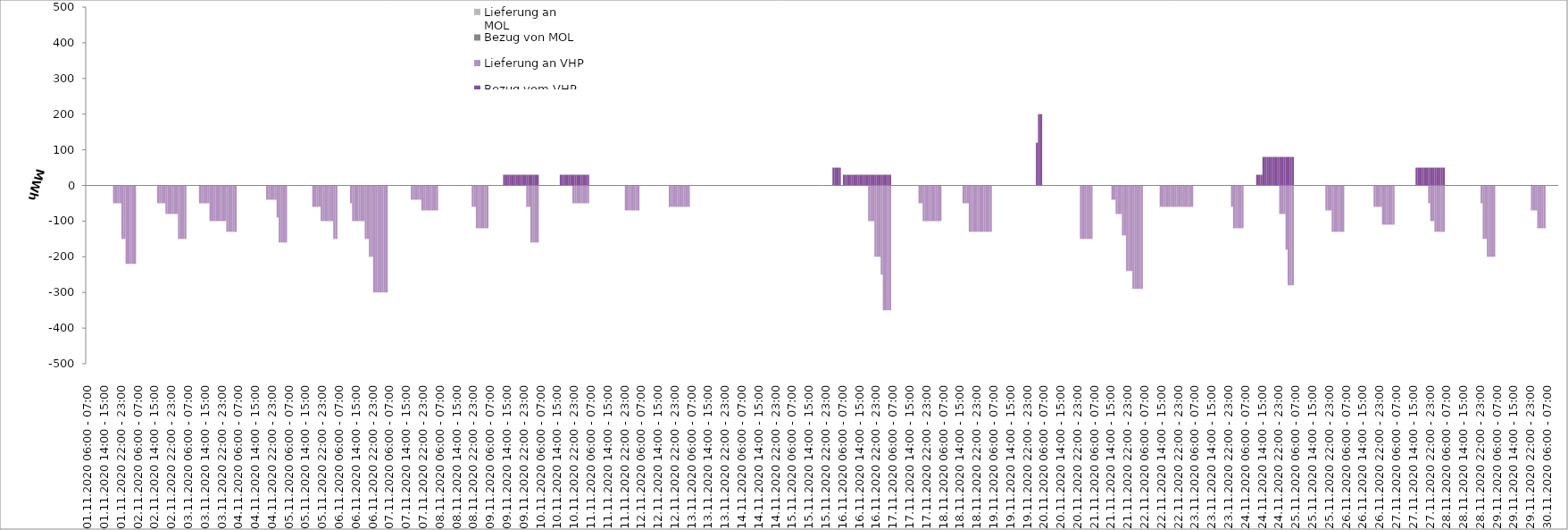
| Category | Bezug vom VHP | Lieferung an VHP | Bezug von MOL | Lieferung an MOL |
|---|---|---|---|---|
| 01.11.2020 06:00 - 07:00 | 0 | 0 | 0 | 0 |
| 01.11.2020 07:00 - 08:00 | 0 | 0 | 0 | 0 |
| 01.11.2020 08:00 - 09:00 | 0 | 0 | 0 | 0 |
| 01.11.2020 09:00 - 10:00 | 0 | 0 | 0 | 0 |
| 01.11.2020 10:00 - 11:00 | 0 | 0 | 0 | 0 |
| 01.11.2020 11:00 - 12:00 | 0 | 0 | 0 | 0 |
| 01.11.2020 12:00 - 13:00 | 0 | 0 | 0 | 0 |
| 01.11.2020 13:00 - 14:00 | 0 | 0 | 0 | 0 |
| 01.11.2020 14:00 - 15:00 | 0 | 0 | 0 | 0 |
| 01.11.2020 15:00 - 16:00 | 0 | 0 | 0 | 0 |
| 01.11.2020 16:00 - 17:00 | 0 | 0 | 0 | 0 |
| 01.11.2020 17:00 - 18:00 | 0 | 0 | 0 | 0 |
| 01.11.2020 18:00 - 19:00 | 0 | 0 | 0 | 0 |
| 01.11.2020 19:00 - 20:00 | 0 | -50 | 0 | 0 |
| 01.11.2020 20:00 - 21:00 | 0 | -50 | 0 | 0 |
| 01.11.2020 21:00 - 22:00 | 0 | -50 | 0 | 0 |
| 01.11.2020 22:00 - 23:00 | 0 | -50 | 0 | 0 |
| 01.11.2020 23:00 - 24:00 | 0 | -150 | 0 | 0 |
| 02.11.2020 00:00 - 01:00 | 0 | -150 | 0 | 0 |
| 02.11.2020 01:00 - 02:00 | 0 | -220 | 0 | 0 |
| 02.11.2020 02:00 - 03:00 | 0 | -220 | 0 | 0 |
| 02.11.2020 03:00 - 04:00 | 0 | -220 | 0 | 0 |
| 02.11.2020 04:00 - 05:00 | 0 | -220 | 0 | 0 |
| 02.11.2020 05:00 - 06:00 | 0 | -220 | 0 | 0 |
| 02.11.2020 06:00 - 07:00 | 0 | 0 | 0 | 0 |
| 02.11.2020 07:00 - 08:00 | 0 | 0 | 0 | 0 |
| 02.11.2020 08:00 - 09:00 | 0 | 0 | 0 | 0 |
| 02.11.2020 09:00 - 10:00 | 0 | 0 | 0 | 0 |
| 02.11.2020 10:00 - 11:00 | 0 | 0 | 0 | 0 |
| 02.11.2020 11:00 - 12:00 | 0 | 0 | 0 | 0 |
| 02.11.2020 12:00 - 13:00 | 0 | 0 | 0 | 0 |
| 02.11.2020 13:00 - 14:00 | 0 | 0 | 0 | 0 |
| 02.11.2020 14:00 - 15:00 | 0 | 0 | 0 | 0 |
| 02.11.2020 15:00 - 16:00 | 0 | 0 | 0 | 0 |
| 02.11.2020 16:00 - 17:00 | 0 | -50 | 0 | 0 |
| 02.11.2020 17:00 - 18:00 | 0 | -50 | 0 | 0 |
| 02.11.2020 18:00 - 19:00 | 0 | -50 | 0 | 0 |
| 02.11.2020 19:00 - 20:00 | 0 | -50 | 0 | 0 |
| 02.11.2020 20:00 - 21:00 | 0 | -80 | 0 | 0 |
| 02.11.2020 21:00 - 22:00 | 0 | -80 | 0 | 0 |
| 02.11.2020 22:00 - 23:00 | 0 | -80 | 0 | 0 |
| 02.11.2020 23:00 - 24:00 | 0 | -80 | 0 | 0 |
| 03.11.2020 00:00 - 01:00 | 0 | -80 | 0 | 0 |
| 03.11.2020 01:00 - 02:00 | 0 | -80 | 0 | 0 |
| 03.11.2020 02:00 - 03:00 | 0 | -150 | 0 | 0 |
| 03.11.2020 03:00 - 04:00 | 0 | -150 | 0 | 0 |
| 03.11.2020 04:00 - 05:00 | 0 | -150 | 0 | 0 |
| 03.11.2020 05:00 - 06:00 | 0 | -150 | 0 | 0 |
| 03.11.2020 06:00 - 07:00 | 0 | 0 | 0 | 0 |
| 03.11.2020 07:00 - 08:00 | 0 | 0 | 0 | 0 |
| 03.11.2020 08:00 - 09:00 | 0 | 0 | 0 | 0 |
| 03.11.2020 09:00 - 10:00 | 0 | 0 | 0 | 0 |
| 03.11.2020 10:00 - 11:00 | 0 | 0 | 0 | 0 |
| 03.11.2020 11:00 - 12:00 | 0 | 0 | 0 | 0 |
| 03.11.2020 12:00 - 13:00 | 0 | -50 | 0 | 0 |
| 03.11.2020 13:00 - 14:00 | 0 | -50 | 0 | 0 |
| 03.11.2020 14:00 - 15:00 | 0 | -50 | 0 | 0 |
| 03.11.2020 15:00 - 16:00 | 0 | -50 | 0 | 0 |
| 03.11.2020 16:00 - 17:00 | 0 | -50 | 0 | 0 |
| 03.11.2020 17:00 - 18:00 | 0 | -100 | 0 | 0 |
| 03.11.2020 18:00 - 19:00 | 0 | -100 | 0 | 0 |
| 03.11.2020 19:00 - 20:00 | 0 | -100 | 0 | 0 |
| 03.11.2020 20:00 - 21:00 | 0 | -100 | 0 | 0 |
| 03.11.2020 21:00 - 22:00 | 0 | -100 | 0 | 0 |
| 03.11.2020 22:00 - 23:00 | 0 | -100 | 0 | 0 |
| 03.11.2020 23:00 - 24:00 | 0 | -100 | 0 | 0 |
| 04.11.2020 00:00 - 01:00 | 0 | -100 | 0 | 0 |
| 04.11.2020 01:00 - 02:00 | 0 | -130 | 0 | 0 |
| 04.11.2020 02:00 - 03:00 | 0 | -130 | 0 | 0 |
| 04.11.2020 03:00 - 04:00 | 0 | -130 | 0 | 0 |
| 04.11.2020 04:00 - 05:00 | 0 | -130 | 0 | 0 |
| 04.11.2020 05:00 - 06:00 | 0 | -130 | 0 | 0 |
| 04.11.2020 06:00 - 07:00 | 0 | 0 | 0 | 0 |
| 04.11.2020 07:00 - 08:00 | 0 | 0 | 0 | 0 |
| 04.11.2020 08:00 - 09:00 | 0 | 0 | 0 | 0 |
| 04.11.2020 09:00 - 10:00 | 0 | 0 | 0 | 0 |
| 04.11.2020 10:00 - 11:00 | 0 | 0 | 0 | 0 |
| 04.11.2020 11:00 - 12:00 | 0 | 0 | 0 | 0 |
| 04.11.2020 12:00 - 13:00 | 0 | 0 | 0 | 0 |
| 04.11.2020 13:00 - 14:00 | 0 | 0 | 0 | 0 |
| 04.11.2020 14:00 - 15:00 | 0 | 0 | 0 | 0 |
| 04.11.2020 15:00 - 16:00 | 0 | 0 | 0 | 0 |
| 04.11.2020 16:00 - 17:00 | 0 | 0 | 0 | 0 |
| 04.11.2020 17:00 - 18:00 | 0 | 0 | 0 | 0 |
| 04.11.2020 18:00 - 19:00 | 0 | 0 | 0 | 0 |
| 04.11.2020 19:00 - 20:00 | 0 | 0 | 0 | 0 |
| 04.11.2020 20:00 - 21:00 | 0 | -40 | 0 | 0 |
| 04.11.2020 21:00 - 22:00 | 0 | -40 | 0 | 0 |
| 04.11.2020 22:00 - 23:00 | 0 | -40 | 0 | 0 |
| 04.11.2020 23:00 - 24:00 | 0 | -40 | 0 | 0 |
| 05.11.2020 00:00 - 01:00 | 0 | -40 | 0 | 0 |
| 05.11.2020 01:00 - 02:00 | 0 | -90 | 0 | 0 |
| 05.11.2020 02:00 - 03:00 | 0 | -160 | 0 | 0 |
| 05.11.2020 03:00 - 04:00 | 0 | -160 | 0 | 0 |
| 05.11.2020 04:00 - 05:00 | 0 | -160 | 0 | 0 |
| 05.11.2020 05:00 - 06:00 | 0 | -160 | 0 | 0 |
| 05.11.2020 06:00 - 07:00 | 0 | 0 | 0 | 0 |
| 05.11.2020 07:00 - 08:00 | 0 | 0 | 0 | 0 |
| 05.11.2020 08:00 - 09:00 | 0 | 0 | 0 | 0 |
| 05.11.2020 09:00 - 10:00 | 0 | 0 | 0 | 0 |
| 05.11.2020 10:00 - 11:00 | 0 | 0 | 0 | 0 |
| 05.11.2020 11:00 - 12:00 | 0 | 0 | 0 | 0 |
| 05.11.2020 12:00 - 13:00 | 0 | 0 | 0 | 0 |
| 05.11.2020 13:00 - 14:00 | 0 | 0 | 0 | 0 |
| 05.11.2020 14:00 - 15:00 | 0 | 0 | 0 | 0 |
| 05.11.2020 15:00 - 16:00 | 0 | 0 | 0 | 0 |
| 05.11.2020 16:00 - 17:00 | 0 | 0 | 0 | 0 |
| 05.11.2020 17:00 - 18:00 | 0 | 0 | 0 | 0 |
| 05.11.2020 18:00 - 19:00 | 0 | -60 | 0 | 0 |
| 05.11.2020 19:00 - 20:00 | 0 | -60 | 0 | 0 |
| 05.11.2020 20:00 - 21:00 | 0 | -60 | 0 | 0 |
| 05.11.2020 21:00 - 22:00 | 0 | -60 | 0 | 0 |
| 05.11.2020 22:00 - 23:00 | 0 | -100 | 0 | 0 |
| 05.11.2020 23:00 - 24:00 | 0 | -100 | 0 | 0 |
| 06.11.2020 00:00 - 01:00 | 0 | -100 | 0 | 0 |
| 06.11.2020 01:00 - 02:00 | 0 | -100 | 0 | 0 |
| 06.11.2020 02:00 - 03:00 | 0 | -100 | 0 | 0 |
| 06.11.2020 03:00 - 04:00 | 0 | -100 | 0 | 0 |
| 06.11.2020 04:00 - 05:00 | 0 | -150 | 0 | 0 |
| 06.11.2020 05:00 - 06:00 | 0 | -150 | 0 | 0 |
| 06.11.2020 06:00 - 07:00 | 0 | 0 | 0 | 0 |
| 06.11.2020 07:00 - 08:00 | 0 | 0 | 0 | 0 |
| 06.11.2020 08:00 - 09:00 | 0 | 0 | 0 | 0 |
| 06.11.2020 09:00 - 10:00 | 0 | 0 | 0 | 0 |
| 06.11.2020 10:00 - 11:00 | 0 | 0 | 0 | 0 |
| 06.11.2020 11:00 - 12:00 | 0 | 0 | 0 | 0 |
| 06.11.2020 12:00 - 13:00 | 0 | -50 | 0 | 0 |
| 06.11.2020 13:00 - 14:00 | 0 | -100 | 0 | 0 |
| 06.11.2020 14:00 - 15:00 | 0 | -100 | 0 | 0 |
| 06.11.2020 15:00 - 16:00 | 0 | -100 | 0 | 0 |
| 06.11.2020 16:00 - 17:00 | 0 | -100 | 0 | 0 |
| 06.11.2020 17:00 - 18:00 | 0 | -100 | 0 | 0 |
| 06.11.2020 18:00 - 19:00 | 0 | -100 | 0 | 0 |
| 06.11.2020 19:00 - 20:00 | 0 | -150 | 0 | 0 |
| 06.11.2020 20:00 - 21:00 | 0 | -150 | 0 | 0 |
| 06.11.2020 21:00 - 22:00 | 0 | -200 | 0 | 0 |
| 06.11.2020 22:00 - 23:00 | 0 | -200 | 0 | 0 |
| 06.11.2020 23:00 - 24:00 | 0 | -300 | 0 | 0 |
| 07.11.2020 00:00 - 01:00 | 0 | -300 | 0 | 0 |
| 07.11.2020 01:00 - 02:00 | 0 | -300 | 0 | 0 |
| 07.11.2020 02:00 - 03:00 | 0 | -300 | 0 | 0 |
| 07.11.2020 03:00 - 04:00 | 0 | -300 | 0 | 0 |
| 07.11.2020 04:00 - 05:00 | 0 | -300 | 0 | 0 |
| 07.11.2020 05:00 - 06:00 | 0 | -300 | 0 | 0 |
| 07.11.2020 06:00 - 07:00 | 0 | 0 | 0 | 0 |
| 07.11.2020 07:00 - 08:00 | 0 | 0 | 0 | 0 |
| 07.11.2020 08:00 - 09:00 | 0 | 0 | 0 | 0 |
| 07.11.2020 09:00 - 10:00 | 0 | 0 | 0 | 0 |
| 07.11.2020 10:00 - 11:00 | 0 | 0 | 0 | 0 |
| 07.11.2020 11:00 - 12:00 | 0 | 0 | 0 | 0 |
| 07.11.2020 12:00 - 13:00 | 0 | 0 | 0 | 0 |
| 07.11.2020 13:00 - 14:00 | 0 | 0 | 0 | 0 |
| 07.11.2020 14:00 - 15:00 | 0 | 0 | 0 | 0 |
| 07.11.2020 15:00 - 16:00 | 0 | 0 | 0 | 0 |
| 07.11.2020 16:00 - 17:00 | 0 | 0 | 0 | 0 |
| 07.11.2020 17:00 - 18:00 | 0 | -40 | 0 | 0 |
| 07.11.2020 18:00 - 19:00 | 0 | -40 | 0 | 0 |
| 07.11.2020 19:00 - 20:00 | 0 | -40 | 0 | 0 |
| 07.11.2020 20:00 - 21:00 | 0 | -40 | 0 | 0 |
| 07.11.2020 21:00 - 22:00 | 0 | -40 | 0 | 0 |
| 07.11.2020 22:00 - 23:00 | 0 | -70 | 0 | 0 |
| 07.11.2020 23:00 - 24:00 | 0 | -70 | 0 | 0 |
| 08.11.2020 00:00 - 01:00 | 0 | -70 | 0 | 0 |
| 08.11.2020 01:00 - 02:00 | 0 | -70 | 0 | 0 |
| 08.11.2020 02:00 - 03:00 | 0 | -70 | 0 | 0 |
| 08.11.2020 03:00 - 04:00 | 0 | -70 | 0 | 0 |
| 08.11.2020 04:00 - 05:00 | 0 | -70 | 0 | 0 |
| 08.11.2020 05:00 - 06:00 | 0 | -70 | 0 | 0 |
| 08.11.2020 06:00 - 07:00 | 0 | 0 | 0 | 0 |
| 08.11.2020 07:00 - 08:00 | 0 | 0 | 0 | 0 |
| 08.11.2020 08:00 - 09:00 | 0 | 0 | 0 | 0 |
| 08.11.2020 09:00 - 10:00 | 0 | 0 | 0 | 0 |
| 08.11.2020 10:00 - 11:00 | 0 | 0 | 0 | 0 |
| 08.11.2020 11:00 - 12:00 | 0 | 0 | 0 | 0 |
| 08.11.2020 12:00 - 13:00 | 0 | 0 | 0 | 0 |
| 08.11.2020 13:00 - 14:00 | 0 | 0 | 0 | 0 |
| 08.11.2020 14:00 - 15:00 | 0 | 0 | 0 | 0 |
| 08.11.2020 15:00 - 16:00 | 0 | 0 | 0 | 0 |
| 08.11.2020 16:00 - 17:00 | 0 | 0 | 0 | 0 |
| 08.11.2020 17:00 - 18:00 | 0 | 0 | 0 | 0 |
| 08.11.2020 18:00 - 19:00 | 0 | 0 | 0 | 0 |
| 08.11.2020 19:00 - 20:00 | 0 | 0 | 0 | 0 |
| 08.11.2020 20:00 - 21:00 | 0 | 0 | 0 | 0 |
| 08.11.2020 21:00 - 22:00 | 0 | 0 | 0 | 0 |
| 08.11.2020 22:00 - 23:00 | 0 | -60 | 0 | 0 |
| 08.11.2020 23:00 - 24:00 | 0 | -60 | 0 | 0 |
| 09.11.2020 00:00 - 01:00 | 0 | -120 | 0 | 0 |
| 09.11.2020 01:00 - 02:00 | 0 | -120 | 0 | 0 |
| 09.11.2020 02:00 - 03:00 | 0 | -120 | 0 | 0 |
| 09.11.2020 03:00 - 04:00 | 0 | -120 | 0 | 0 |
| 09.11.2020 04:00 - 05:00 | 0 | -120 | 0 | 0 |
| 09.11.2020 05:00 - 06:00 | 0 | -120 | 0 | 0 |
| 09.11.2020 06:00 - 07:00 | 0 | 0 | 0 | 0 |
| 09.11.2020 07:00 - 08:00 | 0 | 0 | 0 | 0 |
| 09.11.2020 08:00 - 09:00 | 0 | 0 | 0 | 0 |
| 09.11.2020 09:00 - 10:00 | 0 | 0 | 0 | 0 |
| 09.11.2020 10:00 - 11:00 | 0 | 0 | 0 | 0 |
| 09.11.2020 11:00 - 12:00 | 0 | 0 | 0 | 0 |
| 09.11.2020 12:00 - 13:00 | 0 | 0 | 0 | 0 |
| 09.11.2020 13:00 - 14:00 | 30 | 0 | 0 | 0 |
| 09.11.2020 14:00 - 15:00 | 30 | 0 | 0 | 0 |
| 09.11.2020 15:00 - 16:00 | 30 | 0 | 0 | 0 |
| 09.11.2020 16:00 - 17:00 | 30 | 0 | 0 | 0 |
| 09.11.2020 17:00 - 18:00 | 30 | 0 | 0 | 0 |
| 09.11.2020 18:00 - 19:00 | 30 | 0 | 0 | 0 |
| 09.11.2020 19:00 - 20:00 | 30 | 0 | 0 | 0 |
| 09.11.2020 20:00 - 21:00 | 30 | 0 | 0 | 0 |
| 09.11.2020 21:00 - 22:00 | 30 | 0 | 0 | 0 |
| 09.11.2020 22:00 - 23:00 | 30 | 0 | 0 | 0 |
| 09.11.2020 23:00 - 24:00 | 30 | 0 | 0 | 0 |
| 10.11.2020 00:00 - 01:00 | 30 | -60 | 0 | 0 |
| 10.11.2020 01:00 - 02:00 | 30 | -60 | 0 | 0 |
| 10.11.2020 02:00 - 03:00 | 30 | -160 | 0 | 0 |
| 10.11.2020 03:00 - 04:00 | 30 | -160 | 0 | 0 |
| 10.11.2020 04:00 - 05:00 | 30 | -160 | 0 | 0 |
| 10.11.2020 05:00 - 06:00 | 30 | -160 | 0 | 0 |
| 10.11.2020 06:00 - 07:00 | 0 | 0 | 0 | 0 |
| 10.11.2020 07:00 - 08:00 | 0 | 0 | 0 | 0 |
| 10.11.2020 08:00 - 09:00 | 0 | 0 | 0 | 0 |
| 10.11.2020 09:00 - 10:00 | 0 | 0 | 0 | 0 |
| 10.11.2020 10:00 - 11:00 | 0 | 0 | 0 | 0 |
| 10.11.2020 11:00 - 12:00 | 0 | 0 | 0 | 0 |
| 10.11.2020 12:00 - 13:00 | 0 | 0 | 0 | 0 |
| 10.11.2020 13:00 - 14:00 | 0 | 0 | 0 | 0 |
| 10.11.2020 14:00 - 15:00 | 0 | 0 | 0 | 0 |
| 10.11.2020 15:00 - 16:00 | 0 | 0 | 0 | 0 |
| 10.11.2020 16:00 - 17:00 | 30 | 0 | 0 | 0 |
| 10.11.2020 17:00 - 18:00 | 30 | 0 | 0 | 0 |
| 10.11.2020 18:00 - 19:00 | 30 | 0 | 0 | 0 |
| 10.11.2020 19:00 - 20:00 | 30 | 0 | 0 | 0 |
| 10.11.2020 20:00 - 21:00 | 30 | 0 | 0 | 0 |
| 10.11.2020 21:00 - 22:00 | 30 | 0 | 0 | 0 |
| 10.11.2020 22:00 - 23:00 | 30 | -50 | 0 | 0 |
| 10.11.2020 23:00 - 24:00 | 30 | -50 | 0 | 0 |
| 11.11.2020 00:00 - 01:00 | 30 | -50 | 0 | 0 |
| 11.11.2020 01:00 - 02:00 | 30 | -50 | 0 | 0 |
| 11.11.2020 02:00 - 03:00 | 30 | -50 | 0 | 0 |
| 11.11.2020 03:00 - 04:00 | 30 | -50 | 0 | 0 |
| 11.11.2020 04:00 - 05:00 | 30 | -50 | 0 | 0 |
| 11.11.2020 05:00 - 06:00 | 30 | -50 | 0 | 0 |
| 11.11.2020 06:00 - 07:00 | 0 | 0 | 0 | 0 |
| 11.11.2020 07:00 - 08:00 | 0 | 0 | 0 | 0 |
| 11.11.2020 08:00 - 09:00 | 0 | 0 | 0 | 0 |
| 11.11.2020 09:00 - 10:00 | 0 | 0 | 0 | 0 |
| 11.11.2020 10:00 - 11:00 | 0 | 0 | 0 | 0 |
| 11.11.2020 11:00 - 12:00 | 0 | 0 | 0 | 0 |
| 11.11.2020 12:00 - 13:00 | 0 | 0 | 0 | 0 |
| 11.11.2020 13:00 - 14:00 | 0 | 0 | 0 | 0 |
| 11.11.2020 14:00 - 15:00 | 0 | 0 | 0 | 0 |
| 11.11.2020 15:00 - 16:00 | 0 | 0 | 0 | 0 |
| 11.11.2020 16:00 - 17:00 | 0 | 0 | 0 | 0 |
| 11.11.2020 17:00 - 18:00 | 0 | 0 | 0 | 0 |
| 11.11.2020 18:00 - 19:00 | 0 | 0 | 0 | 0 |
| 11.11.2020 19:00 - 20:00 | 0 | 0 | 0 | 0 |
| 11.11.2020 20:00 - 21:00 | 0 | 0 | 0 | 0 |
| 11.11.2020 21:00 - 22:00 | 0 | 0 | 0 | 0 |
| 11.11.2020 22:00 - 23:00 | 0 | 0 | 0 | 0 |
| 11.11.2020 23:00 - 24:00 | 0 | -70 | 0 | 0 |
| 12.11.2020 00:00 - 01:00 | 0 | -70 | 0 | 0 |
| 12.11.2020 01:00 - 02:00 | 0 | -70 | 0 | 0 |
| 12.11.2020 02:00 - 03:00 | 0 | -70 | 0 | 0 |
| 12.11.2020 03:00 - 04:00 | 0 | -70 | 0 | 0 |
| 12.11.2020 04:00 - 05:00 | 0 | -70 | 0 | 0 |
| 12.11.2020 05:00 - 06:00 | 0 | -70 | 0 | 0 |
| 12.11.2020 06:00 - 07:00 | 0 | 0 | 0 | 0 |
| 12.11.2020 07:00 - 08:00 | 0 | 0 | 0 | 0 |
| 12.11.2020 08:00 - 09:00 | 0 | 0 | 0 | 0 |
| 12.11.2020 09:00 - 10:00 | 0 | 0 | 0 | 0 |
| 12.11.2020 10:00 - 11:00 | 0 | 0 | 0 | 0 |
| 12.11.2020 11:00 - 12:00 | 0 | 0 | 0 | 0 |
| 12.11.2020 12:00 - 13:00 | 0 | 0 | 0 | 0 |
| 12.11.2020 13:00 - 14:00 | 0 | 0 | 0 | 0 |
| 12.11.2020 14:00 - 15:00 | 0 | 0 | 0 | 0 |
| 12.11.2020 15:00 - 16:00 | 0 | 0 | 0 | 0 |
| 12.11.2020 16:00 - 17:00 | 0 | 0 | 0 | 0 |
| 12.11.2020 17:00 - 18:00 | 0 | 0 | 0 | 0 |
| 12.11.2020 18:00 - 19:00 | 0 | 0 | 0 | 0 |
| 12.11.2020 19:00 - 20:00 | 0 | 0 | 0 | 0 |
| 12.11.2020 20:00 - 21:00 | 0 | -60 | 0 | 0 |
| 12.11.2020 21:00 - 22:00 | 0 | -60 | 0 | 0 |
| 12.11.2020 22:00 - 23:00 | 0 | -60 | 0 | 0 |
| 12.11.2020 23:00 - 24:00 | 0 | -60 | 0 | 0 |
| 13.11.2020 00:00 - 01:00 | 0 | -60 | 0 | 0 |
| 13.11.2020 01:00 - 02:00 | 0 | -60 | 0 | 0 |
| 13.11.2020 02:00 - 03:00 | 0 | -60 | 0 | 0 |
| 13.11.2020 03:00 - 04:00 | 0 | -60 | 0 | 0 |
| 13.11.2020 04:00 - 05:00 | 0 | -60 | 0 | 0 |
| 13.11.2020 05:00 - 06:00 | 0 | -60 | 0 | 0 |
| 13.11.2020 06:00 - 07:00 | 0 | 0 | 0 | 0 |
| 13.11.2020 07:00 - 08:00 | 0 | 0 | 0 | 0 |
| 13.11.2020 08:00 - 09:00 | 0 | 0 | 0 | 0 |
| 13.11.2020 09:00 - 10:00 | 0 | 0 | 0 | 0 |
| 13.11.2020 10:00 - 11:00 | 0 | 0 | 0 | 0 |
| 13.11.2020 11:00 - 12:00 | 0 | 0 | 0 | 0 |
| 13.11.2020 12:00 - 13:00 | 0 | 0 | 0 | 0 |
| 13.11.2020 13:00 - 14:00 | 0 | 0 | 0 | 0 |
| 13.11.2020 14:00 - 15:00 | 0 | 0 | 0 | 0 |
| 13.11.2020 15:00 - 16:00 | 0 | 0 | 0 | 0 |
| 13.11.2020 16:00 - 17:00 | 0 | 0 | 0 | 0 |
| 13.11.2020 17:00 - 18:00 | 0 | 0 | 0 | 0 |
| 13.11.2020 18:00 - 19:00 | 0 | 0 | 0 | 0 |
| 13.11.2020 19:00 - 20:00 | 0 | 0 | 0 | 0 |
| 13.11.2020 20:00 - 21:00 | 0 | 0 | 0 | 0 |
| 13.11.2020 21:00 - 22:00 | 0 | 0 | 0 | 0 |
| 13.11.2020 22:00 - 23:00 | 0 | 0 | 0 | 0 |
| 13.11.2020 23:00 - 24:00 | 0 | 0 | 0 | 0 |
| 14.11.2020 00:00 - 01:00 | 0 | 0 | 0 | 0 |
| 14.11.2020 01:00 - 02:00 | 0 | 0 | 0 | 0 |
| 14.11.2020 02:00 - 03:00 | 0 | 0 | 0 | 0 |
| 14.11.2020 03:00 - 04:00 | 0 | 0 | 0 | 0 |
| 14.11.2020 04:00 - 05:00 | 0 | 0 | 0 | 0 |
| 14.11.2020 05:00 - 06:00 | 0 | 0 | 0 | 0 |
| 14.11.2020 06:00 - 07:00 | 0 | 0 | 0 | 0 |
| 14.11.2020 07:00 - 08:00 | 0 | 0 | 0 | 0 |
| 14.11.2020 08:00 - 09:00 | 0 | 0 | 0 | 0 |
| 14.11.2020 09:00 - 10:00 | 0 | 0 | 0 | 0 |
| 14.11.2020 10:00 - 11:00 | 0 | 0 | 0 | 0 |
| 14.11.2020 11:00 - 12:00 | 0 | 0 | 0 | 0 |
| 14.11.2020 12:00 - 13:00 | 0 | 0 | 0 | 0 |
| 14.11.2020 13:00 - 14:00 | 0 | 0 | 0 | 0 |
| 14.11.2020 14:00 - 15:00 | 0 | 0 | 0 | 0 |
| 14.11.2020 15:00 - 16:00 | 0 | 0 | 0 | 0 |
| 14.11.2020 16:00 - 17:00 | 0 | 0 | 0 | 0 |
| 14.11.2020 17:00 - 18:00 | 0 | 0 | 0 | 0 |
| 14.11.2020 18:00 - 19:00 | 0 | 0 | 0 | 0 |
| 14.11.2020 19:00 - 20:00 | 0 | 0 | 0 | 0 |
| 14.11.2020 20:00 - 21:00 | 0 | 0 | 0 | 0 |
| 14.11.2020 21:00 - 22:00 | 0 | 0 | 0 | 0 |
| 14.11.2020 22:00 - 23:00 | 0 | 0 | 0 | 0 |
| 14.11.2020 23:00 - 24:00 | 0 | 0 | 0 | 0 |
| 15.11.2020 00:00 - 01:00 | 0 | 0 | 0 | 0 |
| 15.11.2020 01:00 - 02:00 | 0 | 0 | 0 | 0 |
| 15.11.2020 02:00 - 03:00 | 0 | 0 | 0 | 0 |
| 15.11.2020 03:00 - 04:00 | 0 | 0 | 0 | 0 |
| 15.11.2020 04:00 - 05:00 | 0 | 0 | 0 | 0 |
| 15.11.2020 05:00 - 06:00 | 0 | 0 | 0 | 0 |
| 15.11.2020 06:00 - 07:00 | 0 | 0 | 0 | 0 |
| 15.11.2020 07:00 - 08:00 | 0 | 0 | 0 | 0 |
| 15.11.2020 08:00 - 09:00 | 0 | 0 | 0 | 0 |
| 15.11.2020 09:00 - 10:00 | 0 | 0 | 0 | 0 |
| 15.11.2020 10:00 - 11:00 | 0 | 0 | 0 | 0 |
| 15.11.2020 11:00 - 12:00 | 0 | 0 | 0 | 0 |
| 15.11.2020 12:00 - 13:00 | 0 | 0 | 0 | 0 |
| 15.11.2020 13:00 - 14:00 | 0 | 0 | 0 | 0 |
| 15.11.2020 14:00 - 15:00 | 0 | 0 | 0 | 0 |
| 15.11.2020 15:00 - 16:00 | 0 | 0 | 0 | 0 |
| 15.11.2020 16:00 - 17:00 | 0 | 0 | 0 | 0 |
| 15.11.2020 17:00 - 18:00 | 0 | 0 | 0 | 0 |
| 15.11.2020 18:00 - 19:00 | 0 | 0 | 0 | 0 |
| 15.11.2020 19:00 - 20:00 | 0 | 0 | 0 | 0 |
| 15.11.2020 20:00 - 21:00 | 0 | 0 | 0 | 0 |
| 15.11.2020 21:00 - 22:00 | 0 | 0 | 0 | 0 |
| 15.11.2020 22:00 - 23:00 | 0 | 0 | 0 | 0 |
| 15.11.2020 23:00 - 24:00 | 0 | 0 | 0 | 0 |
| 16.11.2020 00:00 - 01:00 | 0 | 0 | 0 | 0 |
| 16.11.2020 01:00 - 02:00 | 0 | 0 | 0 | 0 |
| 16.11.2020 02:00 - 03:00 | 50 | 0 | 0 | 0 |
| 16.11.2020 03:00 - 04:00 | 50 | 0 | 0 | 0 |
| 16.11.2020 04:00 - 05:00 | 50 | 0 | 0 | 0 |
| 16.11.2020 05:00 - 06:00 | 50 | 0 | 0 | 0 |
| 16.11.2020 06:00 - 07:00 | 0 | 0 | 0 | 0 |
| 16.11.2020 07:00 - 08:00 | 30 | 0 | 0 | 0 |
| 16.11.2020 08:00 - 09:00 | 30 | 0 | 0 | 0 |
| 16.11.2020 09:00 - 10:00 | 30 | 0 | 0 | 0 |
| 16.11.2020 10:00 - 11:00 | 30 | 0 | 0 | 0 |
| 16.11.2020 11:00 - 12:00 | 30 | 0 | 0 | 0 |
| 16.11.2020 12:00 - 13:00 | 30 | 0 | 0 | 0 |
| 16.11.2020 13:00 - 14:00 | 30 | 0 | 0 | 0 |
| 16.11.2020 14:00 - 15:00 | 30 | 0 | 0 | 0 |
| 16.11.2020 15:00 - 16:00 | 30 | 0 | 0 | 0 |
| 16.11.2020 16:00 - 17:00 | 30 | 0 | 0 | 0 |
| 16.11.2020 17:00 - 18:00 | 30 | 0 | 0 | 0 |
| 16.11.2020 18:00 - 19:00 | 30 | 0 | 0 | 0 |
| 16.11.2020 19:00 - 20:00 | 30 | -100 | 0 | 0 |
| 16.11.2020 20:00 - 21:00 | 30 | -100 | 0 | 0 |
| 16.11.2020 21:00 - 22:00 | 30 | -100 | 0 | 0 |
| 16.11.2020 22:00 - 23:00 | 30 | -200 | 0 | 0 |
| 16.11.2020 23:00 - 24:00 | 30 | -200 | 0 | 0 |
| 17.11.2020 00:00 - 01:00 | 30 | -200 | 0 | 0 |
| 17.11.2020 01:00 - 02:00 | 30 | -250 | 0 | 0 |
| 17.11.2020 02:00 - 03:00 | 30 | -350 | 0 | 0 |
| 17.11.2020 03:00 - 04:00 | 30 | -350 | 0 | 0 |
| 17.11.2020 04:00 - 05:00 | 30 | -350 | 0 | 0 |
| 17.11.2020 05:00 - 06:00 | 30 | -350 | 0 | 0 |
| 17.11.2020 06:00 - 07:00 | 0 | 0 | 0 | 0 |
| 17.11.2020 07:00 - 08:00 | 0 | 0 | 0 | 0 |
| 17.11.2020 08:00 - 09:00 | 0 | 0 | 0 | 0 |
| 17.11.2020 09:00 - 10:00 | 0 | 0 | 0 | 0 |
| 17.11.2020 10:00 - 11:00 | 0 | 0 | 0 | 0 |
| 17.11.2020 11:00 - 12:00 | 0 | 0 | 0 | 0 |
| 17.11.2020 12:00 - 13:00 | 0 | 0 | 0 | 0 |
| 17.11.2020 13:00 - 14:00 | 0 | 0 | 0 | 0 |
| 17.11.2020 14:00 - 15:00 | 0 | 0 | 0 | 0 |
| 17.11.2020 15:00 - 16:00 | 0 | 0 | 0 | 0 |
| 17.11.2020 16:00 - 17:00 | 0 | 0 | 0 | 0 |
| 17.11.2020 17:00 - 18:00 | 0 | 0 | 0 | 0 |
| 17.11.2020 18:00 - 19:00 | 0 | 0 | 0 | 0 |
| 17.11.2020 19:00 - 20:00 | 0 | -50 | 0 | 0 |
| 17.11.2020 20:00 - 21:00 | 0 | -50 | 0 | 0 |
| 17.11.2020 21:00 - 22:00 | 0 | -100 | 0 | 0 |
| 17.11.2020 22:00 - 23:00 | 0 | -100 | 0 | 0 |
| 17.11.2020 23:00 - 24:00 | 0 | -100 | 0 | 0 |
| 18.11.2020 00:00 - 01:00 | 0 | -100 | 0 | 0 |
| 18.11.2020 01:00 - 02:00 | 0 | -100 | 0 | 0 |
| 18.11.2020 02:00 - 03:00 | 0 | -100 | 0 | 0 |
| 18.11.2020 03:00 - 04:00 | 0 | -100 | 0 | 0 |
| 18.11.2020 04:00 - 05:00 | 0 | -100 | 0 | 0 |
| 18.11.2020 05:00 - 06:00 | 0 | -100 | 0 | 0 |
| 18.11.2020 06:00 - 07:00 | 0 | 0 | 0 | 0 |
| 18.11.2020 07:00 - 08:00 | 0 | 0 | 0 | 0 |
| 18.11.2020 08:00 - 09:00 | 0 | 0 | 0 | 0 |
| 18.11.2020 09:00 - 10:00 | 0 | 0 | 0 | 0 |
| 18.11.2020 10:00 - 11:00 | 0 | 0 | 0 | 0 |
| 18.11.2020 11:00 - 12:00 | 0 | 0 | 0 | 0 |
| 18.11.2020 12:00 - 13:00 | 0 | 0 | 0 | 0 |
| 18.11.2020 13:00 - 14:00 | 0 | 0 | 0 | 0 |
| 18.11.2020 14:00 - 15:00 | 0 | 0 | 0 | 0 |
| 18.11.2020 15:00 - 16:00 | 0 | 0 | 0 | 0 |
| 18.11.2020 16:00 - 17:00 | 0 | -50 | 0 | 0 |
| 18.11.2020 17:00 - 18:00 | 0 | -50 | 0 | 0 |
| 18.11.2020 18:00 - 19:00 | 0 | -50 | 0 | 0 |
| 18.11.2020 19:00 - 20:00 | 0 | -130 | 0 | 0 |
| 18.11.2020 20:00 - 21:00 | 0 | -130 | 0 | 0 |
| 18.11.2020 21:00 - 22:00 | 0 | -130 | 0 | 0 |
| 18.11.2020 22:00 - 23:00 | 0 | -130 | 0 | 0 |
| 18.11.2020 23:00 - 24:00 | 0 | -130 | 0 | 0 |
| 19.11.2020 00:00 - 01:00 | 0 | -130 | 0 | 0 |
| 19.11.2020 01:00 - 02:00 | 0 | -130 | 0 | 0 |
| 19.11.2020 02:00 - 03:00 | 0 | -130 | 0 | 0 |
| 19.11.2020 03:00 - 04:00 | 0 | -130 | 0 | 0 |
| 19.11.2020 04:00 - 05:00 | 0 | -130 | 0 | 0 |
| 19.11.2020 05:00 - 06:00 | 0 | -130 | 0 | 0 |
| 19.11.2020 06:00 - 07:00 | 0 | 0 | 0 | 0 |
| 19.11.2020 07:00 - 08:00 | 0 | 0 | 0 | 0 |
| 19.11.2020 08:00 - 09:00 | 0 | 0 | 0 | 0 |
| 19.11.2020 09:00 - 10:00 | 0 | 0 | 0 | 0 |
| 19.11.2020 10:00 - 11:00 | 0 | 0 | 0 | 0 |
| 19.11.2020 11:00 - 12:00 | 0 | 0 | 0 | 0 |
| 19.11.2020 12:00 - 13:00 | 0 | 0 | 0 | 0 |
| 19.11.2020 13:00 - 14:00 | 0 | 0 | 0 | 0 |
| 19.11.2020 14:00 - 15:00 | 0 | 0 | 0 | 0 |
| 19.11.2020 15:00 - 16:00 | 0 | 0 | 0 | 0 |
| 19.11.2020 16:00 - 17:00 | 0 | 0 | 0 | 0 |
| 19.11.2020 17:00 - 18:00 | 0 | 0 | 0 | 0 |
| 19.11.2020 18:00 - 19:00 | 0 | 0 | 0 | 0 |
| 19.11.2020 19:00 - 20:00 | 0 | 0 | 0 | 0 |
| 19.11.2020 20:00 - 21:00 | 0 | 0 | 0 | 0 |
| 19.11.2020 21:00 - 22:00 | 0 | 0 | 0 | 0 |
| 19.11.2020 22:00 - 23:00 | 0 | 0 | 0 | 0 |
| 19.11.2020 23:00 - 24:00 | 0 | 0 | 0 | 0 |
| 20.11.2020 00:00 - 01:00 | 0 | 0 | 0 | 0 |
| 20.11.2020 01:00 - 02:00 | 0 | 0 | 0 | 0 |
| 20.11.2020 02:00 - 03:00 | 0 | 0 | 0 | 0 |
| 20.11.2020 03:00 - 04:00 | 120 | 0 | 0 | 0 |
| 20.11.2020 04:00 - 05:00 | 200 | 0 | 0 | 0 |
| 20.11.2020 05:00 - 06:00 | 200 | 0 | 0 | 0 |
| 20.11.2020 06:00 - 07:00 | 0 | 0 | 0 | 0 |
| 20.11.2020 07:00 - 08:00 | 0 | 0 | 0 | 0 |
| 20.11.2020 08:00 - 09:00 | 0 | 0 | 0 | 0 |
| 20.11.2020 09:00 - 10:00 | 0 | 0 | 0 | 0 |
| 20.11.2020 10:00 - 11:00 | 0 | 0 | 0 | 0 |
| 20.11.2020 11:00 - 12:00 | 0 | 0 | 0 | 0 |
| 20.11.2020 12:00 - 13:00 | 0 | 0 | 0 | 0 |
| 20.11.2020 13:00 - 14:00 | 0 | 0 | 0 | 0 |
| 20.11.2020 14:00 - 15:00 | 0 | 0 | 0 | 0 |
| 20.11.2020 15:00 - 16:00 | 0 | 0 | 0 | 0 |
| 20.11.2020 16:00 - 17:00 | 0 | 0 | 0 | 0 |
| 20.11.2020 17:00 - 18:00 | 0 | 0 | 0 | 0 |
| 20.11.2020 18:00 - 19:00 | 0 | 0 | 0 | 0 |
| 20.11.2020 19:00 - 20:00 | 0 | 0 | 0 | 0 |
| 20.11.2020 20:00 - 21:00 | 0 | 0 | 0 | 0 |
| 20.11.2020 21:00 - 22:00 | 0 | 0 | 0 | 0 |
| 20.11.2020 22:00 - 23:00 | 0 | 0 | 0 | 0 |
| 20.11.2020 23:00 - 24:00 | 0 | 0 | 0 | 0 |
| 21.11.2020 00:00 - 01:00 | 0 | -150 | 0 | 0 |
| 21.11.2020 01:00 - 02:00 | 0 | -150 | 0 | 0 |
| 21.11.2020 02:00 - 03:00 | 0 | -150 | 0 | 0 |
| 21.11.2020 03:00 - 04:00 | 0 | -150 | 0 | 0 |
| 21.11.2020 04:00 - 05:00 | 0 | -150 | 0 | 0 |
| 21.11.2020 05:00 - 06:00 | 0 | -150 | 0 | 0 |
| 21.11.2020 06:00 - 07:00 | 0 | 0 | 0 | 0 |
| 21.11.2020 07:00 - 08:00 | 0 | 0 | 0 | 0 |
| 21.11.2020 08:00 - 09:00 | 0 | 0 | 0 | 0 |
| 21.11.2020 09:00 - 10:00 | 0 | 0 | 0 | 0 |
| 21.11.2020 10:00 - 11:00 | 0 | 0 | 0 | 0 |
| 21.11.2020 11:00 - 12:00 | 0 | 0 | 0 | 0 |
| 21.11.2020 12:00 - 13:00 | 0 | 0 | 0 | 0 |
| 21.11.2020 13:00 - 14:00 | 0 | 0 | 0 | 0 |
| 21.11.2020 14:00 - 15:00 | 0 | 0 | 0 | 0 |
| 21.11.2020 15:00 - 16:00 | 0 | -40 | 0 | 0 |
| 21.11.2020 16:00 - 17:00 | 0 | -40 | 0 | 0 |
| 21.11.2020 17:00 - 18:00 | 0 | -80 | 0 | 0 |
| 21.11.2020 18:00 - 19:00 | 0 | -80 | 0 | 0 |
| 21.11.2020 19:00 - 20:00 | 0 | -80 | 0 | 0 |
| 21.11.2020 20:00 - 21:00 | 0 | -140 | 0 | 0 |
| 21.11.2020 21:00 - 22:00 | 0 | -140 | 0 | 0 |
| 21.11.2020 22:00 - 23:00 | 0 | -240 | 0 | 0 |
| 21.11.2020 23:00 - 24:00 | 0 | -240 | 0 | 0 |
| 22.11.2020 00:00 - 01:00 | 0 | -240 | 0 | 0 |
| 22.11.2020 01:00 - 02:00 | 0 | -290 | 0 | 0 |
| 22.11.2020 02:00 - 03:00 | 0 | -290 | 0 | 0 |
| 22.11.2020 03:00 - 04:00 | 0 | -290 | 0 | 0 |
| 22.11.2020 04:00 - 05:00 | 0 | -290 | 0 | 0 |
| 22.11.2020 05:00 - 06:00 | 0 | -290 | 0 | 0 |
| 22.11.2020 06:00 - 07:00 | 0 | 0 | 0 | 0 |
| 22.11.2020 07:00 - 08:00 | 0 | 0 | 0 | 0 |
| 22.11.2020 08:00 - 09:00 | 0 | 0 | 0 | 0 |
| 22.11.2020 09:00 - 10:00 | 0 | 0 | 0 | 0 |
| 22.11.2020 10:00 - 11:00 | 0 | 0 | 0 | 0 |
| 22.11.2020 11:00 - 12:00 | 0 | 0 | 0 | 0 |
| 22.11.2020 12:00 - 13:00 | 0 | 0 | 0 | 0 |
| 22.11.2020 13:00 - 14:00 | 0 | 0 | 0 | 0 |
| 22.11.2020 14:00 - 15:00 | 0 | -60 | 0 | 0 |
| 22.11.2020 15:00 - 16:00 | 0 | -60 | 0 | 0 |
| 22.11.2020 16:00 - 17:00 | 0 | -60 | 0 | 0 |
| 22.11.2020 17:00 - 18:00 | 0 | -60 | 0 | 0 |
| 22.11.2020 18:00 - 19:00 | 0 | -60 | 0 | 0 |
| 22.11.2020 19:00 - 20:00 | 0 | -60 | 0 | 0 |
| 22.11.2020 20:00 - 21:00 | 0 | -60 | 0 | 0 |
| 22.11.2020 21:00 - 22:00 | 0 | -60 | 0 | 0 |
| 22.11.2020 22:00 - 23:00 | 0 | -60 | 0 | 0 |
| 22.11.2020 23:00 - 24:00 | 0 | -60 | 0 | 0 |
| 23.11.2020 00:00 - 01:00 | 0 | -60 | 0 | 0 |
| 23.11.2020 01:00 - 02:00 | 0 | -60 | 0 | 0 |
| 23.11.2020 02:00 - 03:00 | 0 | -60 | 0 | 0 |
| 23.11.2020 03:00 - 04:00 | 0 | -60 | 0 | 0 |
| 23.11.2020 04:00 - 05:00 | 0 | -60 | 0 | 0 |
| 23.11.2020 05:00 - 06:00 | 0 | -60 | 0 | 0 |
| 23.11.2020 06:00 - 07:00 | 0 | 0 | 0 | 0 |
| 23.11.2020 07:00 - 08:00 | 0 | 0 | 0 | 0 |
| 23.11.2020 08:00 - 09:00 | 0 | 0 | 0 | 0 |
| 23.11.2020 09:00 - 10:00 | 0 | 0 | 0 | 0 |
| 23.11.2020 10:00 - 11:00 | 0 | 0 | 0 | 0 |
| 23.11.2020 11:00 - 12:00 | 0 | 0 | 0 | 0 |
| 23.11.2020 12:00 - 13:00 | 0 | 0 | 0 | 0 |
| 23.11.2020 13:00 - 14:00 | 0 | 0 | 0 | 0 |
| 23.11.2020 14:00 - 15:00 | 0 | 0 | 0 | 0 |
| 23.11.2020 15:00 - 16:00 | 0 | 0 | 0 | 0 |
| 23.11.2020 16:00 - 17:00 | 0 | 0 | 0 | 0 |
| 23.11.2020 17:00 - 18:00 | 0 | 0 | 0 | 0 |
| 23.11.2020 18:00 - 19:00 | 0 | 0 | 0 | 0 |
| 23.11.2020 19:00 - 20:00 | 0 | 0 | 0 | 0 |
| 23.11.2020 20:00 - 21:00 | 0 | 0 | 0 | 0 |
| 23.11.2020 21:00 - 22:00 | 0 | 0 | 0 | 0 |
| 23.11.2020 22:00 - 23:00 | 0 | 0 | 0 | 0 |
| 23.11.2020 23:00 - 24:00 | 0 | 0 | 0 | 0 |
| 24.11.2020 00:00 - 01:00 | 0 | -60 | 0 | 0 |
| 24.11.2020 01:00 - 02:00 | 0 | -120 | 0 | 0 |
| 24.11.2020 02:00 - 03:00 | 0 | -120 | 0 | 0 |
| 24.11.2020 03:00 - 04:00 | 0 | -120 | 0 | 0 |
| 24.11.2020 04:00 - 05:00 | 0 | -120 | 0 | 0 |
| 24.11.2020 05:00 - 06:00 | 0 | -120 | 0 | 0 |
| 24.11.2020 06:00 - 07:00 | 0 | 0 | 0 | 0 |
| 24.11.2020 07:00 - 08:00 | 0 | 0 | 0 | 0 |
| 24.11.2020 08:00 - 09:00 | 0 | 0 | 0 | 0 |
| 24.11.2020 09:00 - 10:00 | 0 | 0 | 0 | 0 |
| 24.11.2020 10:00 - 11:00 | 0 | 0 | 0 | 0 |
| 24.11.2020 11:00 - 12:00 | 0 | 0 | 0 | 0 |
| 24.11.2020 12:00 - 13:00 | 30 | 0 | 0 | 0 |
| 24.11.2020 13:00 - 14:00 | 30 | 0 | 0 | 0 |
| 24.11.2020 14:00 - 15:00 | 30 | 0 | 0 | 0 |
| 24.11.2020 15:00 - 16:00 | 80 | 0 | 0 | 0 |
| 24.11.2020 16:00 - 17:00 | 80 | 0 | 0 | 0 |
| 24.11.2020 17:00 - 18:00 | 80 | 0 | 0 | 0 |
| 24.11.2020 18:00 - 19:00 | 80 | 0 | 0 | 0 |
| 24.11.2020 19:00 - 20:00 | 80 | 0 | 0 | 0 |
| 24.11.2020 20:00 - 21:00 | 80 | 0 | 0 | 0 |
| 24.11.2020 21:00 - 22:00 | 80 | 0 | 0 | 0 |
| 24.11.2020 22:00 - 23:00 | 80 | 0 | 0 | 0 |
| 24.11.2020 23:00 - 24:00 | 80 | -80 | 0 | 0 |
| 25.11.2020 00:00 - 01:00 | 80 | -80 | 0 | 0 |
| 25.11.2020 01:00 - 02:00 | 80 | -80 | 0 | 0 |
| 25.11.2020 02:00 - 03:00 | 80 | -180 | 0 | 0 |
| 25.11.2020 03:00 - 04:00 | 80 | -280 | 0 | 0 |
| 25.11.2020 04:00 - 05:00 | 80 | -280 | 0 | 0 |
| 25.11.2020 05:00 - 06:00 | 80 | -280 | 0 | 0 |
| 25.11.2020 06:00 - 07:00 | 0 | 0 | 0 | 0 |
| 25.11.2020 07:00 - 08:00 | 0 | 0 | 0 | 0 |
| 25.11.2020 08:00 - 09:00 | 0 | 0 | 0 | 0 |
| 25.11.2020 09:00 - 10:00 | 0 | 0 | 0 | 0 |
| 25.11.2020 10:00 - 11:00 | 0 | 0 | 0 | 0 |
| 25.11.2020 11:00 - 12:00 | 0 | 0 | 0 | 0 |
| 25.11.2020 12:00 - 13:00 | 0 | 0 | 0 | 0 |
| 25.11.2020 13:00 - 14:00 | 0 | 0 | 0 | 0 |
| 25.11.2020 14:00 - 15:00 | 0 | 0 | 0 | 0 |
| 25.11.2020 15:00 - 16:00 | 0 | 0 | 0 | 0 |
| 25.11.2020 16:00 - 17:00 | 0 | 0 | 0 | 0 |
| 25.11.2020 17:00 - 18:00 | 0 | 0 | 0 | 0 |
| 25.11.2020 18:00 - 19:00 | 0 | 0 | 0 | 0 |
| 25.11.2020 19:00 - 20:00 | 0 | 0 | 0 | 0 |
| 25.11.2020 20:00 - 21:00 | 0 | 0 | 0 | 0 |
| 25.11.2020 21:00 - 22:00 | 0 | -70 | 0 | 0 |
| 25.11.2020 22:00 - 23:00 | 0 | -70 | 0 | 0 |
| 25.11.2020 23:00 - 24:00 | 0 | -70 | 0 | 0 |
| 26.11.2020 00:00 - 01:00 | 0 | -130 | 0 | 0 |
| 26.11.2020 01:00 - 02:00 | 0 | -130 | 0 | 0 |
| 26.11.2020 02:00 - 03:00 | 0 | -130 | 0 | 0 |
| 26.11.2020 03:00 - 04:00 | 0 | -130 | 0 | 0 |
| 26.11.2020 04:00 - 05:00 | 0 | -130 | 0 | 0 |
| 26.11.2020 05:00 - 06:00 | 0 | -130 | 0 | 0 |
| 26.11.2020 06:00 - 07:00 | 0 | 0 | 0 | 0 |
| 26.11.2020 07:00 - 08:00 | 0 | 0 | 0 | 0 |
| 26.11.2020 08:00 - 09:00 | 0 | 0 | 0 | 0 |
| 26.11.2020 09:00 - 10:00 | 0 | 0 | 0 | 0 |
| 26.11.2020 10:00 - 11:00 | 0 | 0 | 0 | 0 |
| 26.11.2020 11:00 - 12:00 | 0 | 0 | 0 | 0 |
| 26.11.2020 12:00 - 13:00 | 0 | 0 | 0 | 0 |
| 26.11.2020 13:00 - 14:00 | 0 | 0 | 0 | 0 |
| 26.11.2020 14:00 - 15:00 | 0 | 0 | 0 | 0 |
| 26.11.2020 15:00 - 16:00 | 0 | 0 | 0 | 0 |
| 26.11.2020 16:00 - 17:00 | 0 | 0 | 0 | 0 |
| 26.11.2020 17:00 - 18:00 | 0 | 0 | 0 | 0 |
| 26.11.2020 18:00 - 19:00 | 0 | 0 | 0 | 0 |
| 26.11.2020 19:00 - 20:00 | 0 | 0 | 0 | 0 |
| 26.11.2020 20:00 - 21:00 | 0 | -60 | 0 | 0 |
| 26.11.2020 21:00 - 22:00 | 0 | -60 | 0 | 0 |
| 26.11.2020 22:00 - 23:00 | 0 | -60 | 0 | 0 |
| 26.11.2020 23:00 - 24:00 | 0 | -60 | 0 | 0 |
| 27.11.2020 00:00 - 01:00 | 0 | -110 | 0 | 0 |
| 27.11.2020 01:00 - 02:00 | 0 | -110 | 0 | 0 |
| 27.11.2020 02:00 - 03:00 | 0 | -110 | 0 | 0 |
| 27.11.2020 03:00 - 04:00 | 0 | -110 | 0 | 0 |
| 27.11.2020 04:00 - 05:00 | 0 | -110 | 0 | 0 |
| 27.11.2020 05:00 - 06:00 | 0 | -110 | 0 | 0 |
| 27.11.2020 06:00 - 07:00 | 0 | 0 | 0 | 0 |
| 27.11.2020 07:00 - 08:00 | 0 | 0 | 0 | 0 |
| 27.11.2020 08:00 - 09:00 | 0 | 0 | 0 | 0 |
| 27.11.2020 09:00 - 10:00 | 0 | 0 | 0 | 0 |
| 27.11.2020 10:00 - 11:00 | 0 | 0 | 0 | 0 |
| 27.11.2020 11:00 - 12:00 | 0 | 0 | 0 | 0 |
| 27.11.2020 12:00 - 13:00 | 0 | 0 | 0 | 0 |
| 27.11.2020 13:00 - 14:00 | 0 | 0 | 0 | 0 |
| 27.11.2020 14:00 - 15:00 | 0 | 0 | 0 | 0 |
| 27.11.2020 15:00 - 16:00 | 0 | 0 | 0 | 0 |
| 27.11.2020 16:00 - 17:00 | 50 | 0 | 0 | 0 |
| 27.11.2020 17:00 - 18:00 | 50 | 0 | 0 | 0 |
| 27.11.2020 18:00 - 19:00 | 50 | 0 | 0 | 0 |
| 27.11.2020 19:00 - 20:00 | 50 | 0 | 0 | 0 |
| 27.11.2020 20:00 - 21:00 | 50 | 0 | 0 | 0 |
| 27.11.2020 21:00 - 22:00 | 50 | 0 | 0 | 0 |
| 27.11.2020 22:00 - 23:00 | 50 | -50 | 0 | 0 |
| 27.11.2020 23:00 - 24:00 | 50 | -100 | 0 | 0 |
| 28.11.2020 00:00 - 01:00 | 50 | -100 | 0 | 0 |
| 28.11.2020 01:00 - 02:00 | 50 | -130 | 0 | 0 |
| 28.11.2020 02:00 - 03:00 | 50 | -130 | 0 | 0 |
| 28.11.2020 03:00 - 04:00 | 50 | -130 | 0 | 0 |
| 28.11.2020 04:00 - 05:00 | 50 | -130 | 0 | 0 |
| 28.11.2020 05:00 - 06:00 | 50 | -130 | 0 | 0 |
| 28.11.2020 06:00 - 07:00 | 0 | 0 | 0 | 0 |
| 28.11.2020 07:00 - 08:00 | 0 | 0 | 0 | 0 |
| 28.11.2020 08:00 - 09:00 | 0 | 0 | 0 | 0 |
| 28.11.2020 09:00 - 10:00 | 0 | 0 | 0 | 0 |
| 28.11.2020 10:00 - 11:00 | 0 | 0 | 0 | 0 |
| 28.11.2020 11:00 - 12:00 | 0 | 0 | 0 | 0 |
| 28.11.2020 12:00 - 13:00 | 0 | 0 | 0 | 0 |
| 28.11.2020 13:00 - 14:00 | 0 | 0 | 0 | 0 |
| 28.11.2020 14:00 - 15:00 | 0 | 0 | 0 | 0 |
| 28.11.2020 15:00 - 16:00 | 0 | 0 | 0 | 0 |
| 28.11.2020 16:00 - 17:00 | 0 | 0 | 0 | 0 |
| 28.11.2020 17:00 - 18:00 | 0 | 0 | 0 | 0 |
| 28.11.2020 18:00 - 19:00 | 0 | 0 | 0 | 0 |
| 28.11.2020 19:00 - 20:00 | 0 | 0 | 0 | 0 |
| 28.11.2020 20:00 - 21:00 | 0 | 0 | 0 | 0 |
| 28.11.2020 21:00 - 22:00 | 0 | 0 | 0 | 0 |
| 28.11.2020 22:00 - 23:00 | 0 | 0 | 0 | 0 |
| 28.11.2020 23:00 - 24:00 | 0 | -50 | 0 | 0 |
| 29.11.2020 00:00 - 01:00 | 0 | -150 | 0 | 0 |
| 29.11.2020 01:00 - 02:00 | 0 | -150 | 0 | 0 |
| 29.11.2020 02:00 - 03:00 | 0 | -200 | 0 | 0 |
| 29.11.2020 03:00 - 04:00 | 0 | -200 | 0 | 0 |
| 29.11.2020 04:00 - 05:00 | 0 | -200 | 0 | 0 |
| 29.11.2020 05:00 - 06:00 | 0 | -200 | 0 | 0 |
| 29.11.2020 06:00 - 07:00 | 0 | 0 | 0 | 0 |
| 29.11.2020 07:00 - 08:00 | 0 | 0 | 0 | 0 |
| 29.11.2020 08:00 - 09:00 | 0 | 0 | 0 | 0 |
| 29.11.2020 09:00 - 10:00 | 0 | 0 | 0 | 0 |
| 29.11.2020 10:00 - 11:00 | 0 | 0 | 0 | 0 |
| 29.11.2020 11:00 - 12:00 | 0 | 0 | 0 | 0 |
| 29.11.2020 12:00 - 13:00 | 0 | 0 | 0 | 0 |
| 29.11.2020 13:00 - 14:00 | 0 | 0 | 0 | 0 |
| 29.11.2020 14:00 - 15:00 | 0 | 0 | 0 | 0 |
| 29.11.2020 15:00 - 16:00 | 0 | 0 | 0 | 0 |
| 29.11.2020 16:00 - 17:00 | 0 | 0 | 0 | 0 |
| 29.11.2020 17:00 - 18:00 | 0 | 0 | 0 | 0 |
| 29.11.2020 18:00 - 19:00 | 0 | 0 | 0 | 0 |
| 29.11.2020 19:00 - 20:00 | 0 | 0 | 0 | 0 |
| 29.11.2020 20:00 - 21:00 | 0 | 0 | 0 | 0 |
| 29.11.2020 21:00 - 22:00 | 0 | 0 | 0 | 0 |
| 29.11.2020 22:00 - 23:00 | 0 | 0 | 0 | 0 |
| 29.11.2020 23:00 - 24:00 | 0 | -70 | 0 | 0 |
| 30.11.2020 00:00 - 01:00 | 0 | -70 | 0 | 0 |
| 30.11.2020 01:00 - 02:00 | 0 | -70 | 0 | 0 |
| 30.11.2020 02:00 - 03:00 | 0 | -120 | 0 | 0 |
| 30.11.2020 03:00 - 04:00 | 0 | -120 | 0 | 0 |
| 30.11.2020 04:00 - 05:00 | 0 | -120 | 0 | 0 |
| 30.11.2020 05:00 - 06:00 | 0 | -120 | 0 | 0 |
| 30.11.2020 06:00 - 07:00 | 0 | 0 | 0 | 0 |
| 30.11.2020 07:00 - 08:00 | 0 | 0 | 0 | 0 |
| 30.11.2020 08:00 - 09:00 | 0 | 0 | 0 | 0 |
| 30.11.2020 09:00 - 10:00 | 0 | 0 | 0 | 0 |
| 30.11.2020 10:00 - 11:00 | 0 | 0 | 0 | 0 |
| 30.11.2020 11:00 - 12:00 | 0 | 0 | 0 | 0 |